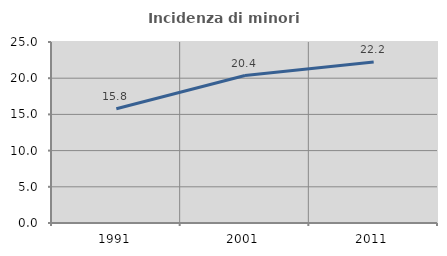
| Category | Incidenza di minori stranieri |
|---|---|
| 1991.0 | 15.789 |
| 2001.0 | 20.37 |
| 2011.0 | 22.222 |